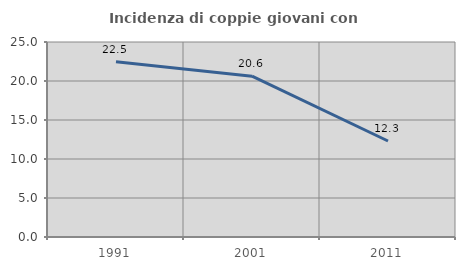
| Category | Incidenza di coppie giovani con figli |
|---|---|
| 1991.0 | 22.472 |
| 2001.0 | 20.615 |
| 2011.0 | 12.308 |